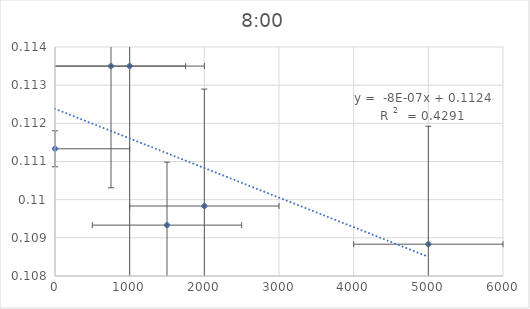
| Category | Series 0 |
|---|---|
| 5000.0 | 0.109 |
| 2000.0 | 0.11 |
| 1500.0 | 0.109 |
| 1000.0 | 0.114 |
| 750.0 | 0.114 |
| 0.0 | 0.111 |